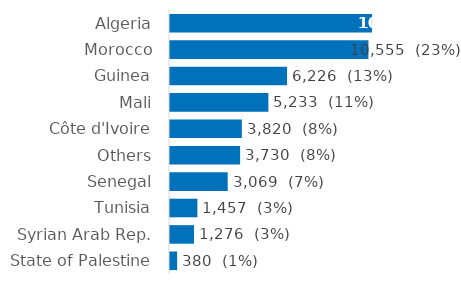
| Category | Series 0 |
|---|---|
| Algeria | 10746 |
| Morocco | 10555 |
| Guinea | 6226 |
| Mali | 5233 |
| Côte d'Ivoire | 3820 |
| Others | 3730 |
| Senegal | 3069 |
| Tunisia | 1457 |
| Syrian Arab Rep. | 1276 |
| State of Palestine | 380 |